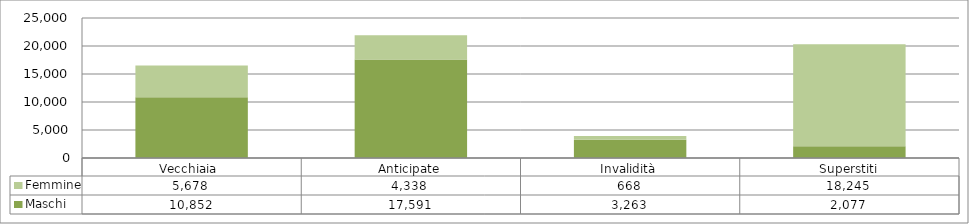
| Category | Maschi | Femmine |
|---|---|---|
| Vecchiaia  | 10852 | 5678 |
| Anticipate | 17591 | 4338 |
| Invalidità | 3263 | 668 |
| Superstiti | 2077 | 18245 |